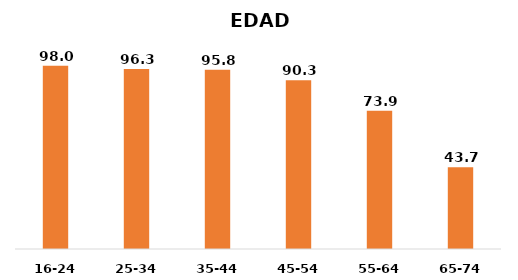
| Category | Series 0 |
|---|---|
| 16-24 | 98 |
| 25-34 | 96.3 |
| 35-44 | 95.8 |
| 45-54 | 90.3 |
| 55-64 | 73.9 |
| 65-74 | 43.7 |